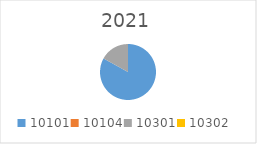
| Category | Series 0 |
|---|---|
| 10101.0 | 5810624.7 |
| 10104.0 | 0 |
| 10301.0 | 1185908.75 |
| 10302.0 | 0 |